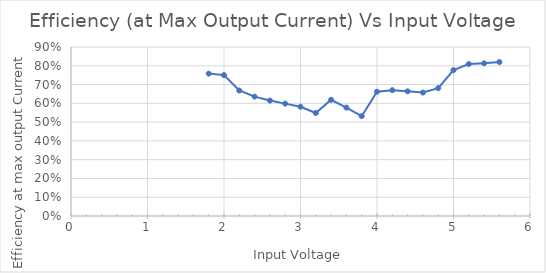
| Category | Series 0 |
|---|---|
| 1.8 | 0.758 |
| 2.0 | 0.75 |
| 2.2 | 0.668 |
| 2.4 | 0.636 |
| 2.6 | 0.615 |
| 2.8 | 0.598 |
| 3.0 | 0.582 |
| 3.2 | 0.548 |
| 3.4 | 0.619 |
| 3.6 | 0.577 |
| 3.8 | 0.532 |
| 4.0 | 0.662 |
| 4.2 | 0.67 |
| 4.4 | 0.664 |
| 4.6 | 0.657 |
| 4.8 | 0.681 |
| 5.0 | 0.777 |
| 5.2 | 0.809 |
| 5.4 | 0.813 |
| 5.6 | 0.82 |